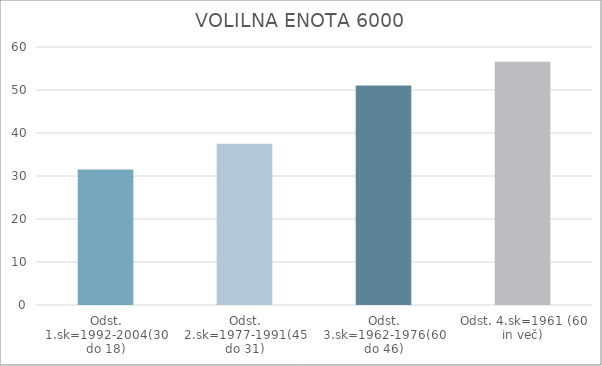
| Category | Series 0 |
|---|---|
| Odst. 1.sk=1992-2004(30 do 18) | 31.54 |
| Odst. 2.sk=1977-1991(45 do 31) | 37.48 |
| Odst. 3.sk=1962-1976(60 do 46) | 51.03 |
| Odst. 4.sk=1961 (60 in več) | 56.56 |